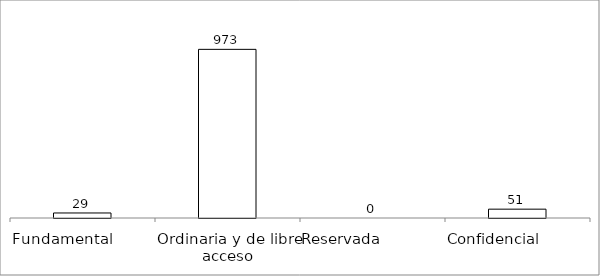
| Category | Series 0 |
|---|---|
| Fundamental         | 29 |
| Ordinaria y de libre acceso | 973 |
| Reservada               | 0 |
| Confidencial             | 51 |